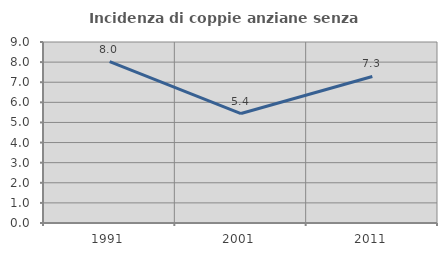
| Category | Incidenza di coppie anziane senza figli  |
|---|---|
| 1991.0 | 8.029 |
| 2001.0 | 5.442 |
| 2011.0 | 7.285 |